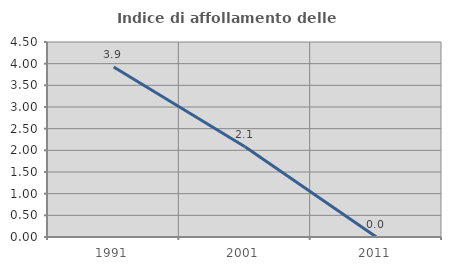
| Category | Indice di affollamento delle abitazioni  |
|---|---|
| 1991.0 | 3.922 |
| 2001.0 | 2.083 |
| 2011.0 | 0 |